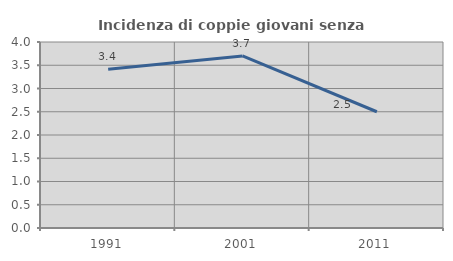
| Category | Incidenza di coppie giovani senza figli |
|---|---|
| 1991.0 | 3.416 |
| 2001.0 | 3.7 |
| 2011.0 | 2.5 |